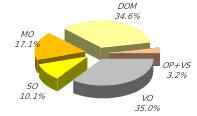
| Category | Series 0 |
|---|---|
| VO | 346214.923 |
| SO | 99701.041 |
| MO | 168615.161 |
| DOM | 342074.483 |
| OP+VS | 31246.407 |